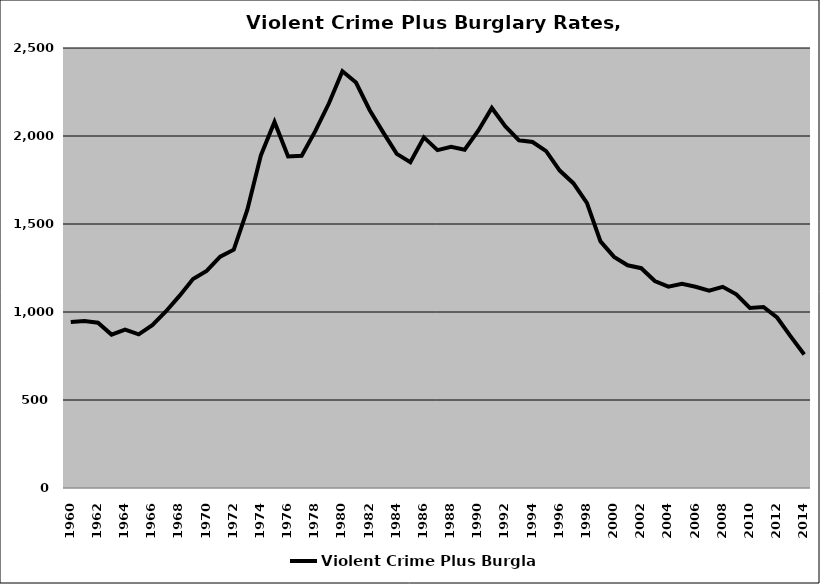
| Category | Violent Crime Plus Burglary |
|---|---|
| 1960.0 | 942.779 |
| 1961.0 | 949.113 |
| 1962.0 | 939.316 |
| 1963.0 | 871.577 |
| 1964.0 | 899.342 |
| 1965.0 | 872.896 |
| 1966.0 | 925.34 |
| 1967.0 | 1002.828 |
| 1968.0 | 1091.571 |
| 1969.0 | 1187.155 |
| 1970.0 | 1233.339 |
| 1971.0 | 1314.023 |
| 1972.0 | 1354.12 |
| 1973.0 | 1580.99 |
| 1974.0 | 1891.322 |
| 1975.0 | 2079.937 |
| 1976.0 | 1884.148 |
| 1977.0 | 1887.559 |
| 1978.0 | 2027.377 |
| 1979.0 | 2184.47 |
| 1980.0 | 2367.684 |
| 1981.0 | 2303.998 |
| 1982.0 | 2148.122 |
| 1983.0 | 2020.495 |
| 1984.0 | 1898.263 |
| 1985.0 | 1850.568 |
| 1986.0 | 1992.196 |
| 1987.0 | 1919.902 |
| 1988.0 | 1939.094 |
| 1989.0 | 1921.873 |
| 1990.0 | 2030.348 |
| 1991.0 | 2159.222 |
| 1992.0 | 2054.595 |
| 1993.0 | 1975.276 |
| 1994.0 | 1965.997 |
| 1995.0 | 1913.702 |
| 1996.0 | 1803.554 |
| 1997.0 | 1731.893 |
| 1998.0 | 1619.618 |
| 1999.0 | 1401.161 |
| 2000.0 | 1312.844 |
| 2001.0 | 1265.376 |
| 2002.0 | 1248.955 |
| 2003.0 | 1175.745 |
| 2004.0 | 1144.217 |
| 2005.0 | 1160.408 |
| 2006.0 | 1143.683 |
| 2007.0 | 1120.805 |
| 2008.0 | 1143.102 |
| 2009.0 | 1100.159 |
| 2010.0 | 1022.818 |
| 2011.0 | 1028.34 |
| 2012.0 | 968.714 |
| 2013.0 | 861.476 |
| 2014.0 | 758.281 |